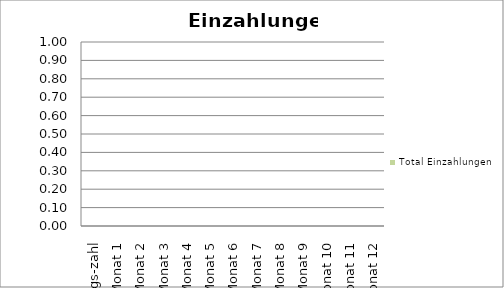
| Category | Total Einzahlungen |
|---|---|
| Anfangs-zahl | 0 |
| Monat 1 | 0 |
| Monat 2 | 0 |
| Monat 3 | 0 |
| Monat 4 | 0 |
| Monat 5 | 0 |
| Monat 6 | 0 |
| Monat 7 | 0 |
| Monat 8 | 0 |
| Monat 9 | 0 |
| Monat 10 | 0 |
| Monat 11 | 0 |
| Monat 12 | 0 |